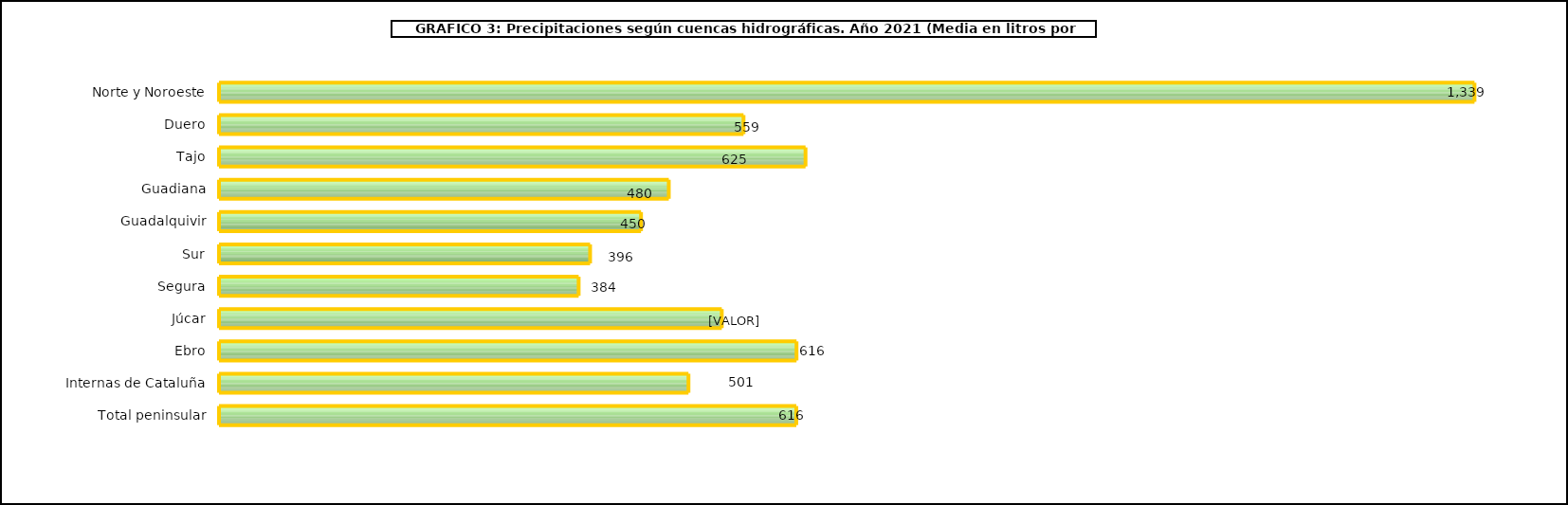
| Category | cuencas |
|---|---|
| 0 | 1338.7 |
| 1 | 559.3 |
| 2 | 625.4 |
| 3 | 479.6 |
| 4 | 450 |
| 5 | 395.7 |
| 6 | 383.5 |
| 7 | 536.1 |
| 8 | 615.8 |
| 9 | 500.6 |
| 10 | 615.6 |